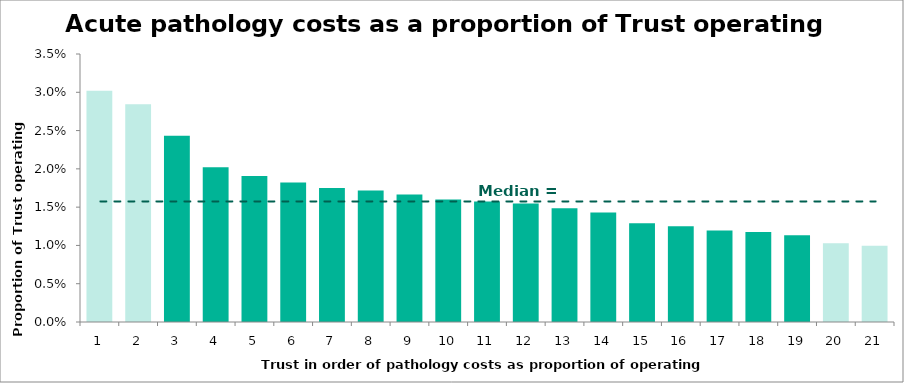
| Category | Cost |
|---|---|
| 0 | 0.03 |
| 1 | 0.028 |
| 2 | 0.024 |
| 3 | 0.02 |
| 4 | 0.019 |
| 5 | 0.018 |
| 6 | 0.017 |
| 7 | 0.017 |
| 8 | 0.017 |
| 9 | 0.016 |
| 10 | 0.016 |
| 11 | 0.015 |
| 12 | 0.015 |
| 13 | 0.014 |
| 14 | 0.013 |
| 15 | 0.013 |
| 16 | 0.012 |
| 17 | 0.012 |
| 18 | 0.011 |
| 19 | 0.01 |
| 20 | 0.01 |